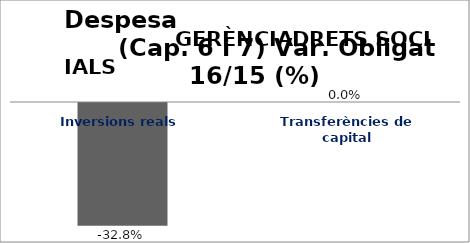
| Category | Series 0 |
|---|---|
| Inversions reals | -0.328 |
| Transferències de capital | 0 |